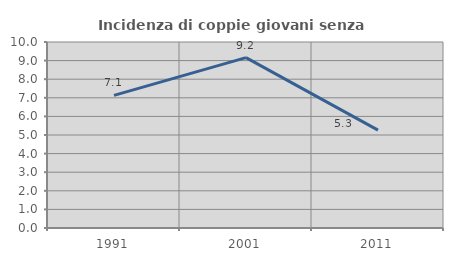
| Category | Incidenza di coppie giovani senza figli |
|---|---|
| 1991.0 | 7.127 |
| 2001.0 | 9.159 |
| 2011.0 | 5.263 |